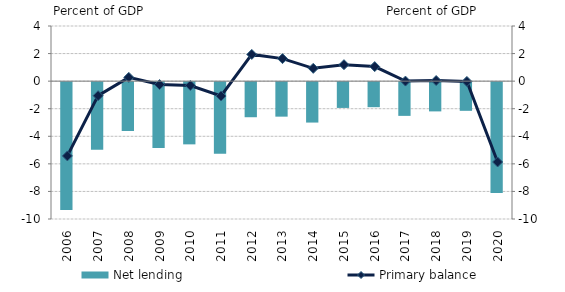
| Category | Net lending |
|---|---|
| 2006.0 | -9.269 |
| 2007.0 | -4.902 |
| 2008.0 | -3.544 |
| 2009.0 | -4.777 |
| 2010.0 | -4.513 |
| 2011.0 | -5.194 |
| 2012.0 | -2.545 |
| 2013.0 | -2.503 |
| 2014.0 | -2.932 |
| 2015.0 | -1.871 |
| 2016.0 | -1.817 |
| 2017.0 | -2.447 |
| 2018.0 | -2.122 |
| 2019.0 | -2.081 |
| 2020.0 | -8.05 |